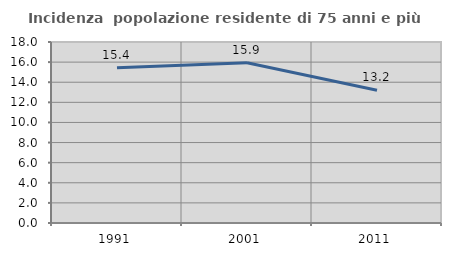
| Category | Incidenza  popolazione residente di 75 anni e più |
|---|---|
| 1991.0 | 15.441 |
| 2001.0 | 15.931 |
| 2011.0 | 13.199 |